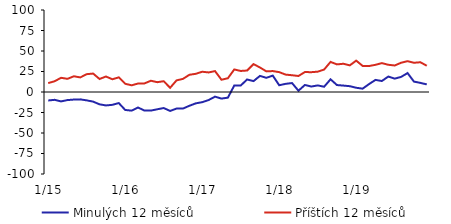
| Category | Minulých 12 měsíců | Příštích 12 měsíců |
|---|---|---|
|  1/15 | -10.32 | 10.88 |
|  2/15 | -9.55 | 13.1 |
|  3/15 | -11.45 | 17.32 |
|  4/15 | -9.85 | 16.04 |
|  5/15 | -9.22 | 19.19 |
|  6/15 | -8.99 | 17.77 |
|  7/15 | -10.2 | 21.74 |
|  8/15 | -11.76 | 22.49 |
|  9/15 | -15.03 | 15.86 |
|  10/15 | -16.38 | 18.89 |
|  11/15 | -15.64 | 15.55 |
|  12/15 | -13.49 | 17.84 |
|  1/16 | -21.91 | 10.03 |
|  2/16 | -22.72 | 8.16 |
|  3/16 | -18.91 | 10.34 |
|  4/16 | -22.65 | 10.48 |
|  5/16 | -22.69 | 13.73 |
|  6/16 | -21.05 | 11.99 |
|  7/16 | -19.56 | 13.15 |
|  8/16 | -23.1 | 5.15 |
|  9/16 | -20.21 | 14.17 |
|  10/16 | -20.19 | 16 |
|  11/16 | -16.81 | 20.99 |
|  12/16 | -13.84 | 22.19 |
|  1/17 | -12.4 | 24.7 |
|  2/17 | -9.79 | 23.87 |
|  3/17 | -5.67 | 25.48 |
|  4/17 | -8.04 | 14.94 |
|  5/17 | -6.9 | 16.78 |
|  6/17 | 7.95 | 27.5 |
|  7/17 | 7.9 | 25.66 |
|  8/17 | 15.28 | 26.2 |
|  9/17 | 13.3 | 34.02 |
|  10/17 | 19.64 | 29.89 |
|  11/17 | 17.29 | 25.16 |
|  12/17 | 20.01 | 25.53 |
|  1/18 | 8.26 | 24.23 |
|  2/18 | 9.94 | 21.21 |
|  3/18 | 10.91 | 20.44 |
|  4/18 | 1.56 | 19.52 |
|  5/18 | 8.57 | 24.34 |
|  6/18 | 6.65 | 24.16 |
|  7/18 | 8.04 | 24.79 |
|  8/18 | 6.42 | 27.41 |
|  9/18 | 15.48 | 36.69 |
|  10/18 | 8.47 | 33.68 |
|  11/18 | 7.83 | 34.44 |
|  12/18 | 7.09 | 32.48 |
|  1/19 | 5.17 | 38.27 |
|  2/19 | 4.08 | 31.81 |
|  3/19 | 9.64 | 31.65 |
|  4/19 | 14.75 | 33.17 |
|  5/19 | 13.42 | 35.21 |
|  6/19 | 18.83 | 33.2 |
|  7/19 | 16.3 | 32.33 |
|  8/19 | 18.42 | 35.7 |
|  9/19 | 23.07 | 37.61 |
|  10/19 | 12.67 | 35.65 |
|  11/19 | 11.15 | 36.29 |
|  12/19 | 9.22 | 32.02 |